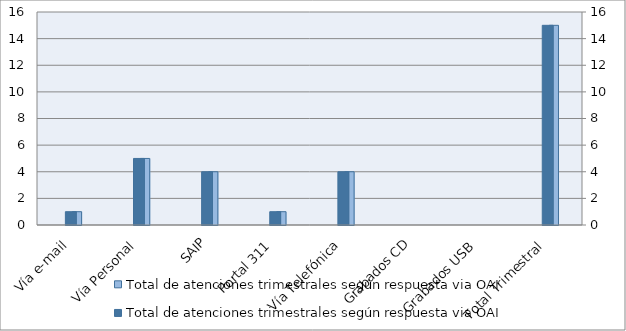
| Category | Total de atenciones trimestrales según respuesta via OAI | Series 2 | Series 4 |
|---|---|---|---|
| Vía e-mail | 1 |  |  |
| Vía Personal | 5 |  |  |
| SAIP | 4 |  |  |
| Portal 311 | 1 |  |  |
| Vía Telefónica | 4 |  |  |
| Grabados CD | 0 |  |  |
| Grabados USB | 0 |  |  |
| Total Trimestral | 15 |  |  |